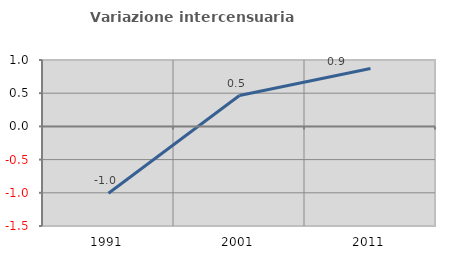
| Category | Variazione intercensuaria annua |
|---|---|
| 1991.0 | -1.007 |
| 2001.0 | 0.465 |
| 2011.0 | 0.872 |